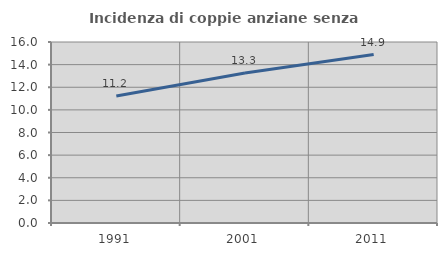
| Category | Incidenza di coppie anziane senza figli  |
|---|---|
| 1991.0 | 11.233 |
| 2001.0 | 13.261 |
| 2011.0 | 14.891 |